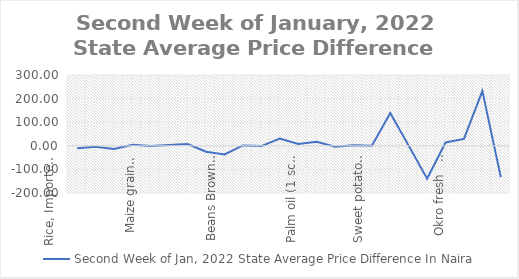
| Category | Second Week of Jan, 2022 |
|---|---|
| Rice, Imported, High Quality Sold loose  (1 mudu) | -10.87 |
| Rice, Agric Sold Loose(Low quality) imported  (1 mudu) | -4.348 |
| Rice Local, Sold Loose   (1 mudu) | -13.261 |
| Maize grain, white sold loose   (1 mudu) | 3.913 |
| Maize grain, yellow sold loose   (1 mudu) | -0.652 |
| Sorghum (Guinea Corn) white or brown, sold loose   (1 mudu) | 3.261 |
| millet (jero or maiwa) sold loose   (1 mudu) | 7.174 |
| Beans: white black eye. Sold loose   (1 mudu) | -25 |
| Beans Brown, sold loose  (1 mudu) | -36.957 |
| Soya Beans, sold loose    (1 mudu) | 1.522 |
| Gari White, sold loose  (1 mudu) | -1.087 |
| Gari Yellow, sold loose   (1 mudu) | 30.435 |
| Palm oil (1 schnap bottle) | 7.391 |
| Yam tuber (1 Medium Size) | 17.391 |
| Cassava tuber | -4.348 |
| Irish potato  (4 Litre rubber) | 2.174 |
| Sweet potato  (5 Medium Size) | 0 |
| Local live chicken  | 139.13 |
| Groundnut - shelled (fresh) | 0 |
| Tomato fresh   (4 Litre rubber) | -139.13 |
| Okro fresh     (1 mudu) | 14.13 |
| Okro dried    (1 mudu) | 29.348 |
| Onion   (4 Litre rubber) | 232.609 |
| Pepper fresh   (4 Litre rubber) | -132.609 |